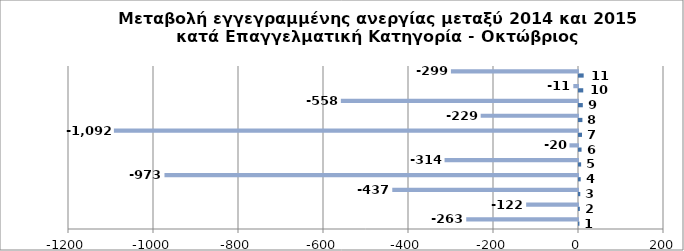
| Category | Series 0 | Series 1 |
|---|---|---|
| 0 | 1 | -263 |
| 1 | 2 | -122 |
| 2 | 3 | -437 |
| 3 | 4 | -973 |
| 4 | 5 | -314 |
| 5 | 6 | -20 |
| 6 | 7 | -1092 |
| 7 | 8 | -229 |
| 8 | 9 | -558 |
| 9 | 10 | -11 |
| 10 | 11 | -299 |